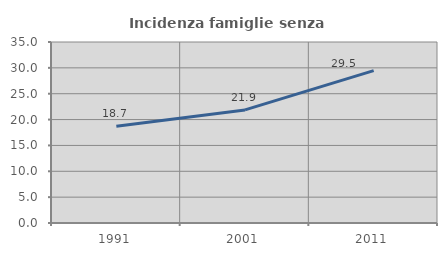
| Category | Incidenza famiglie senza nuclei |
|---|---|
| 1991.0 | 18.717 |
| 2001.0 | 21.871 |
| 2011.0 | 29.474 |